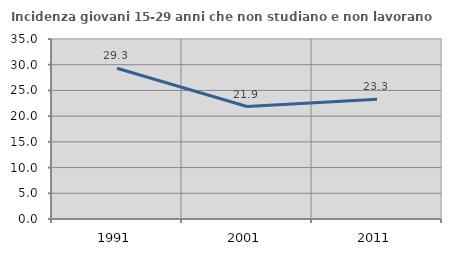
| Category | Incidenza giovani 15-29 anni che non studiano e non lavorano  |
|---|---|
| 1991.0 | 29.302 |
| 2001.0 | 21.875 |
| 2011.0 | 23.27 |